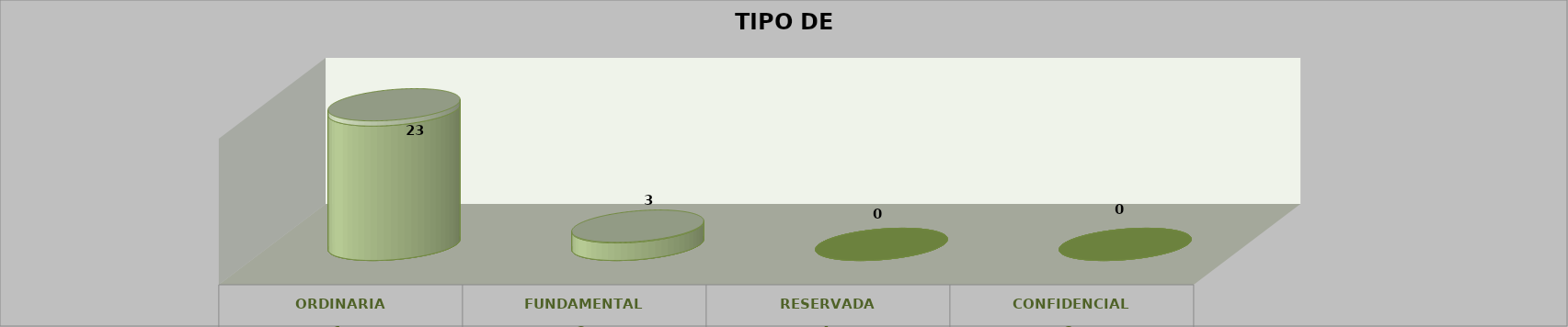
| Category | Series 0 | Series 2 | Series 1 | Series 3 | Series 4 |
|---|---|---|---|---|---|
| 0 |  |  |  | 23 | 0.885 |
| 1 |  |  |  | 3 | 0.115 |
| 2 |  |  |  | 0 | 0 |
| 3 |  |  |  | 0 | 0 |